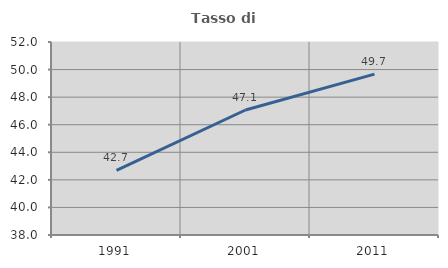
| Category | Tasso di occupazione   |
|---|---|
| 1991.0 | 42.695 |
| 2001.0 | 47.068 |
| 2011.0 | 49.671 |